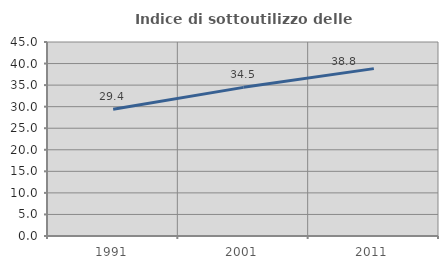
| Category | Indice di sottoutilizzo delle abitazioni  |
|---|---|
| 1991.0 | 29.402 |
| 2001.0 | 34.479 |
| 2011.0 | 38.826 |